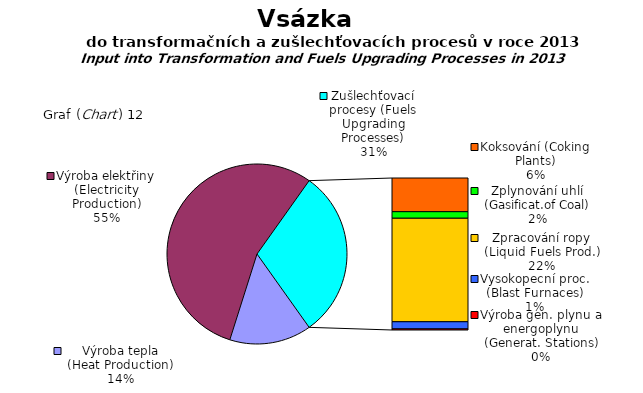
| Category | Výroba tepla (Heat Production) Výroba elektřiny (Electricity Production) Koksování (Coking Plants) Zplynování uhlí (Gasificat.of Coal) Zpracování ropy (Liquid Fuels Prod.) Vysokopecní proc. (Blast Furnaces) Výroba gen. plynu a energoplynu (Generat. Statio |
|---|---|
| Výroba tepla (Heat Production) | 210347 |
| Výroba elektřiny (Electricity Production) | 785302.2 |
| Koksování (Coking Plants) | 96043.367 |
| Zplynování uhlí (Gasificat.of Coal) | 18749.265 |
| Zpracování ropy (Liquid Fuels Prod.) | 295025.755 |
| Vysokopecní proc. (Blast Furnaces) | 20513.235 |
| Výroba gen. plynu a energoplynu (Generat. Stations) | 3014.974 |